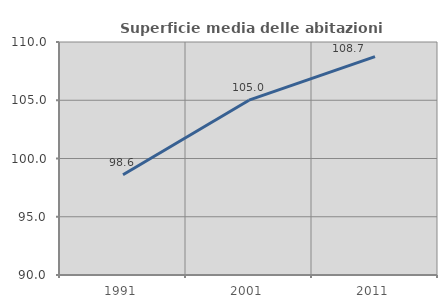
| Category | Superficie media delle abitazioni occupate |
|---|---|
| 1991.0 | 98.6 |
| 2001.0 | 105.006 |
| 2011.0 | 108.738 |